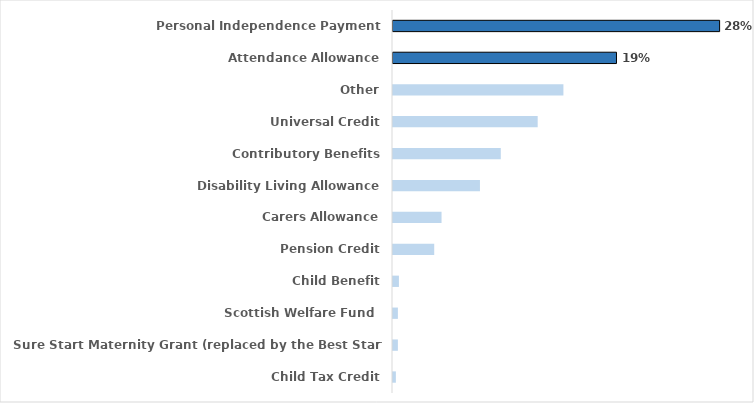
| Category | East Lothian |
|---|---|
| Personal Independence Payment | 0.278 |
| Attendance Allowance | 0.19 |
| Other | 0.145 |
| Universal Credit | 0.123 |
| Contributory Benefits | 0.092 |
| Disability Living Allowance | 0.074 |
| Carers Allowance | 0.041 |
| Pension Credit | 0.035 |
| Child Benefit | 0.005 |
| Scottish Welfare Fund  | 0.004 |
| Sure Start Maternity Grant (replaced by the Best Start Grant) | 0.004 |
| Child Tax Credit | 0.002 |